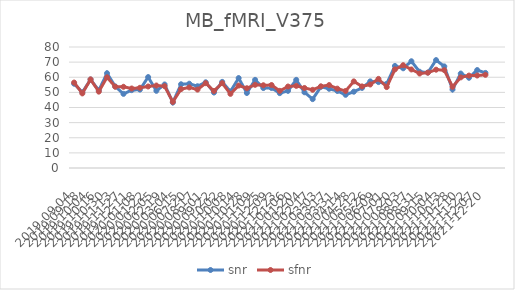
| Category | snr | sfnr |
|---|---|---|
| 2019-09-04 | 55.721 | 56.499 |
| 2019-09-18 | 50.04 | 49.321 |
| 2019-10-04 | 58.481 | 58.575 |
| 2019-10-16 | 51.317 | 50.497 |
| 2019-10-30 | 62.651 | 59.984 |
| 2019-11-13 | 53.918 | 53.739 |
| 2019-11-27 | 49.012 | 53.691 |
| 2019-12-11 | 51.475 | 52.56 |
| 2020-01-08 | 51.834 | 53.026 |
| 2020-01-22 | 60.107 | 53.897 |
| 2020-02-05 | 51.046 | 54.535 |
| 2020-02-19 | 55.219 | 54.088 |
| 2020-03-04 | 43.326 | 43.692 |
| 2020-06-15 | 55.353 | 52.178 |
| 2020-07-20 | 55.723 | 53.275 |
| 2020-08-17 | 54.052 | 51.836 |
| 2020-09-01 | 56.664 | 56.088 |
| 2020-09-22 | 49.893 | 50.914 |
| 2020-10-02 | 56.933 | 56.114 |
| 2020-10-08 | 50.551 | 49.015 |
| 2020-10-14 | 59.45 | 54.516 |
| 2020-10-28 | 49.601 | 52.736 |
| 2020-11-09 | 58.274 | 55.009 |
| 2020-11-25 | 52.856 | 54.701 |
| 2020-12-09 | 52.897 | 54.855 |
| 2020-12-23 | 49.488 | 51.006 |
| 2021-01-06 | 51.004 | 53.876 |
| 2021-01-20 | 58.273 | 54.312 |
| 2021-02-04 | 50.076 | 52.919 |
| 2021-02-17 | 45.534 | 51.698 |
| 2021-03-03 | 53.699 | 53.988 |
| 2021-03-17 | 52.389 | 54.829 |
| 2021-03-31 | 50.913 | 52.463 |
| 2021-04-14 | 48.39 | 50.926 |
| 2021-04-28 | 50.446 | 57.255 |
| 2021-05-12 | 52.956 | 53.938 |
| 2021-05-26 | 57.282 | 55.215 |
| 2021-06-09 | 56.807 | 58.923 |
| 2021-07-01 | 55.639 | 53.502 |
| 2021-07-20 | 67.473 | 65.189 |
| 2021-08-03 | 65.933 | 67.972 |
| 2021-08-17 | 70.582 | 65.151 |
| 2021-08-31 | 63.636 | 62.46 |
| 2021-09-15 | 63.106 | 63.025 |
| 2021-10-04 | 71.336 | 65 |
| 2021-10-13 | 67.183 | 64.695 |
| 2021-10-28 | 51.929 | 53.683 |
| 2021-11-10 | 62.446 | 59.919 |
| 2021-11-22 | 59.655 | 61.105 |
| 2021-12-07 | 64.758 | 61.144 |
| 2021-12-20 | 62.859 | 61.607 |